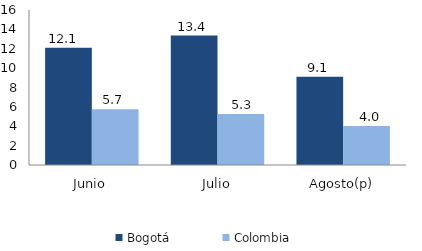
| Category | Bogotá | Colombia |
|---|---|---|
| Junio | 12.109 | 5.746 |
| Julio | 13.367 | 5.266 |
| Agosto(p) | 9.111 | 4.027 |